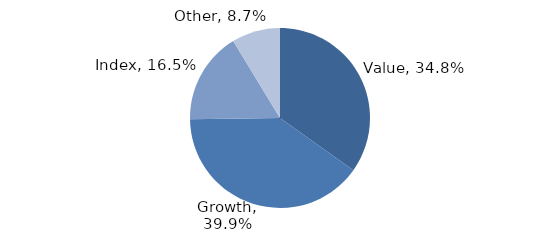
| Category | Investment Style |
|---|---|
| Value | 0.348 |
| Growth | 0.399 |
| Index | 0.165 |
| Other | 0.087 |